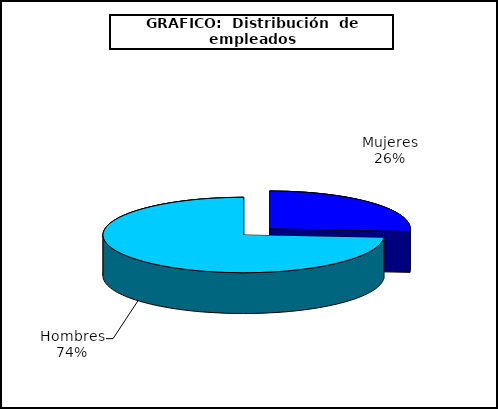
| Category | persona |
|---|---|
| 0 | 4229 |
| 1 | 11922 |